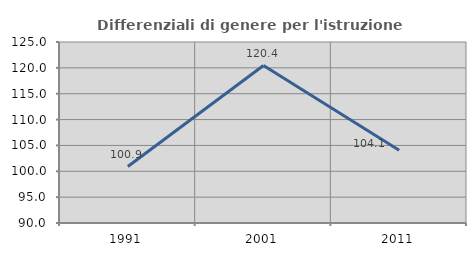
| Category | Differenziali di genere per l'istruzione superiore |
|---|---|
| 1991.0 | 100.921 |
| 2001.0 | 120.445 |
| 2011.0 | 104.071 |